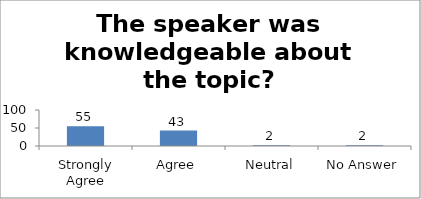
| Category | The speaker was knowledgeable about the topic? |
|---|---|
| Strongly Agree | 55 |
| Agree | 43 |
| Neutral | 2 |
| No Answer | 2 |